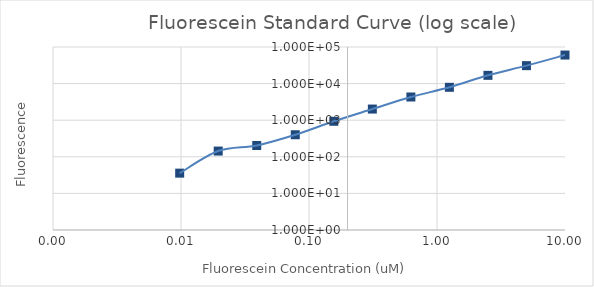
| Category | Series 1 |
|---|---|
| 10.0 | 60269.25 |
| 5.0 | 30940.25 |
| 2.5 | 16822 |
| 1.25 | 7917.75 |
| 0.625 | 4307.25 |
| 0.3125 | 2016.25 |
| 0.15625 | 934 |
| 0.078125 | 400.5 |
| 0.0390625 | 203.75 |
| 0.01953125 | 143.5 |
| 0.009765625 | 35.75 |